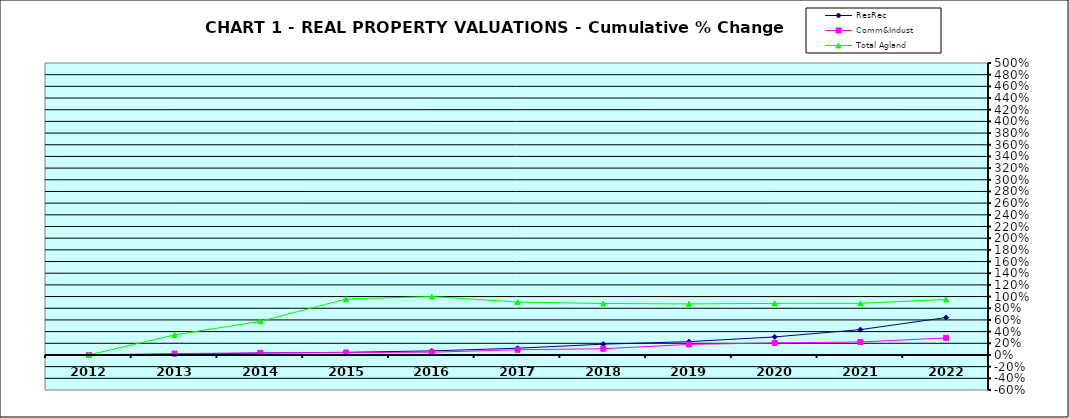
| Category | ResRec | Comm&Indust | Total Agland |
|---|---|---|---|
| 2012.0 | 0 | 0 | 0 |
| 2013.0 | 0.013 | 0.024 | 0.344 |
| 2014.0 | 0.033 | 0.036 | 0.577 |
| 2015.0 | 0.045 | 0.042 | 0.958 |
| 2016.0 | 0.07 | 0.047 | 1.001 |
| 2017.0 | 0.115 | 0.089 | 0.905 |
| 2018.0 | 0.185 | 0.106 | 0.881 |
| 2019.0 | 0.227 | 0.181 | 0.874 |
| 2020.0 | 0.309 | 0.207 | 0.883 |
| 2021.0 | 0.434 | 0.222 | 0.883 |
| 2022.0 | 0.641 | 0.292 | 0.952 |